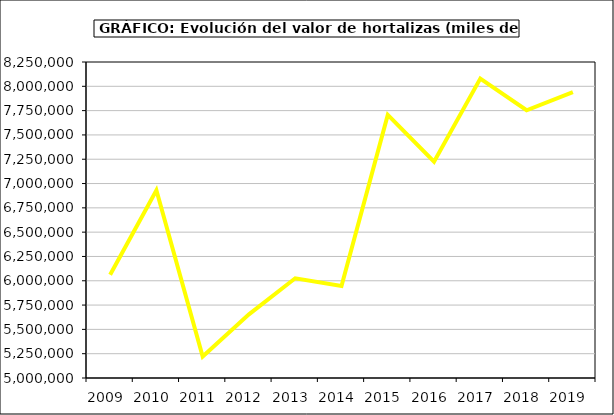
| Category | Valor |
|---|---|
| 2009.0 | 6061506.811 |
| 2010.0 | 6931312.064 |
| 2011.0 | 5220724.649 |
| 2012.0 | 5654821.085 |
| 2013.0 | 6025736 |
| 2014.0 | 5945397.615 |
| 2015.0 | 7705933 |
| 2016.0 | 7225476.342 |
| 2017.0 | 8079271.573 |
| 2018.0 | 7753853.605 |
| 2019.0 | 7940649.854 |